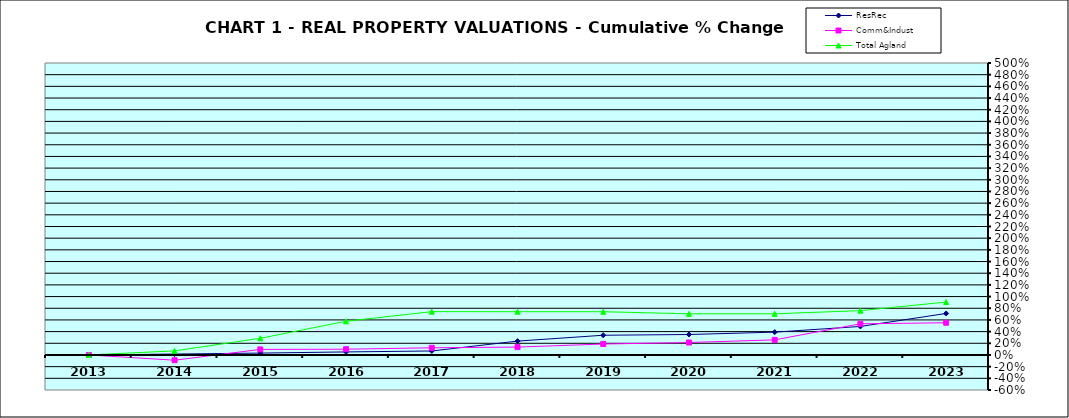
| Category | ResRec | Comm&Indust | Total Agland |
|---|---|---|---|
| 2013.0 | 0 | 0 | 0 |
| 2014.0 | 0.016 | -0.09 | 0.07 |
| 2015.0 | 0.032 | 0.095 | 0.285 |
| 2016.0 | 0.052 | 0.099 | 0.578 |
| 2017.0 | 0.068 | 0.123 | 0.742 |
| 2018.0 | 0.237 | 0.135 | 0.741 |
| 2019.0 | 0.338 | 0.187 | 0.741 |
| 2020.0 | 0.35 | 0.213 | 0.705 |
| 2021.0 | 0.391 | 0.259 | 0.705 |
| 2022.0 | 0.488 | 0.534 | 0.759 |
| 2023.0 | 0.711 | 0.552 | 0.906 |